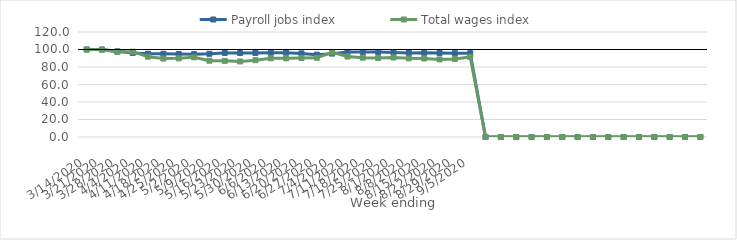
| Category | Payroll jobs index | Total wages index |
|---|---|---|
| 14/03/2020 | 100 | 100 |
| 21/03/2020 | 99.976 | 99.814 |
| 28/03/2020 | 97.95 | 97.23 |
| 04/04/2020 | 96.109 | 97.524 |
| 11/04/2020 | 95.19 | 91.793 |
| 18/04/2020 | 95.095 | 89.656 |
| 25/04/2020 | 94.869 | 89.864 |
| 02/05/2020 | 94.706 | 91.091 |
| 09/05/2020 | 95.096 | 87.184 |
| 16/05/2020 | 96.055 | 87.014 |
| 23/05/2020 | 95.934 | 86.334 |
| 30/05/2020 | 96.064 | 87.759 |
| 06/06/2020 | 96.27 | 89.882 |
| 13/06/2020 | 96.399 | 89.88 |
| 20/06/2020 | 95.565 | 90.306 |
| 27/06/2020 | 94.116 | 90.515 |
| 04/07/2020 | 95.287 | 96.66 |
| 11/07/2020 | 97.047 | 91.958 |
| 18/07/2020 | 97.017 | 90.646 |
| 25/07/2020 | 97.006 | 90.242 |
| 01/08/2020 | 96.643 | 90.848 |
| 08/08/2020 | 96.003 | 89.887 |
| 15/08/2020 | 96.248 | 89.687 |
| 22/08/2020 | 96.043 | 88.68 |
| 29/08/2020 | 95.754 | 89.23 |
| 05/09/2020 | 95.82 | 91.507 |